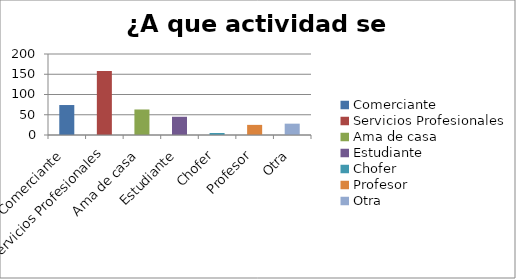
| Category | ¿A que actividad se dedica? |
|---|---|
| Comerciante | 74 |
| Servicios Profesionales | 158 |
| Ama de casa  | 63 |
| Estudiante | 45 |
| Chofer | 5 |
| Profesor | 25 |
| Otra | 28 |